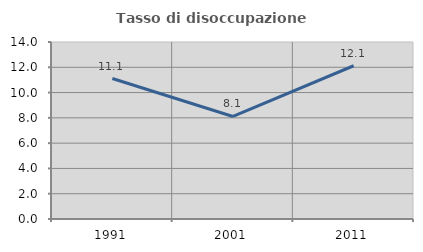
| Category | Tasso di disoccupazione giovanile  |
|---|---|
| 1991.0 | 11.111 |
| 2001.0 | 8.108 |
| 2011.0 | 12.121 |